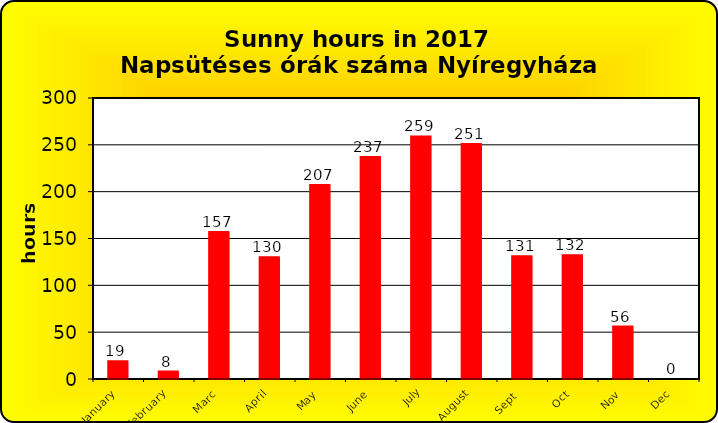
| Category | Series 0 |
|---|---|
| January | 19 |
| February | 8 |
| Marc | 157 |
| April | 130 |
| May | 207 |
| June | 237 |
| July | 259 |
| August | 251 |
| Sept  | 131 |
| Oct | 132 |
| Nov | 56 |
| Dec | 0 |